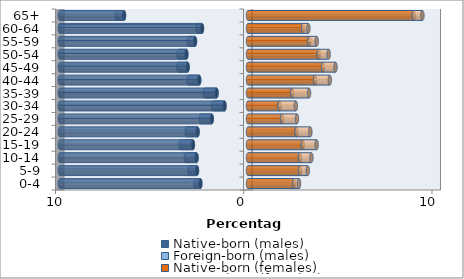
| Category | Native-born (males) | Foreign-born (males) | Native-born (females) | Foreign-born (females) |
|---|---|---|---|---|
| 0-4 | -2.531 | -0.256 | 2.454 | 0.256 |
| 5-9 | -2.711 | -0.4 | 2.764 | 0.411 |
| 10-14 | -2.735 | -0.57 | 2.759 | 0.608 |
| 15-19 | -2.927 | -0.638 | 2.915 | 0.733 |
| 20-24 | -2.68 | -0.576 | 2.58 | 0.732 |
| 25-29 | -1.925 | -0.57 | 1.809 | 0.792 |
| 30-34 | -1.252 | -0.6 | 1.679 | 0.863 |
| 35-39 | -1.672 | -0.625 | 2.354 | 0.89 |
| 40-44 | -2.593 | -0.567 | 3.564 | 0.783 |
| 45-49 | -3.21 | -0.492 | 3.991 | 0.657 |
| 50-54 | -3.274 | -0.411 | 3.761 | 0.523 |
| 55-59 | -2.816 | -0.324 | 3.257 | 0.395 |
| 60-64 | -2.444 | -0.233 | 2.926 | 0.281 |
| 65+ | -6.588 | -0.379 | 8.806 | 0.461 |